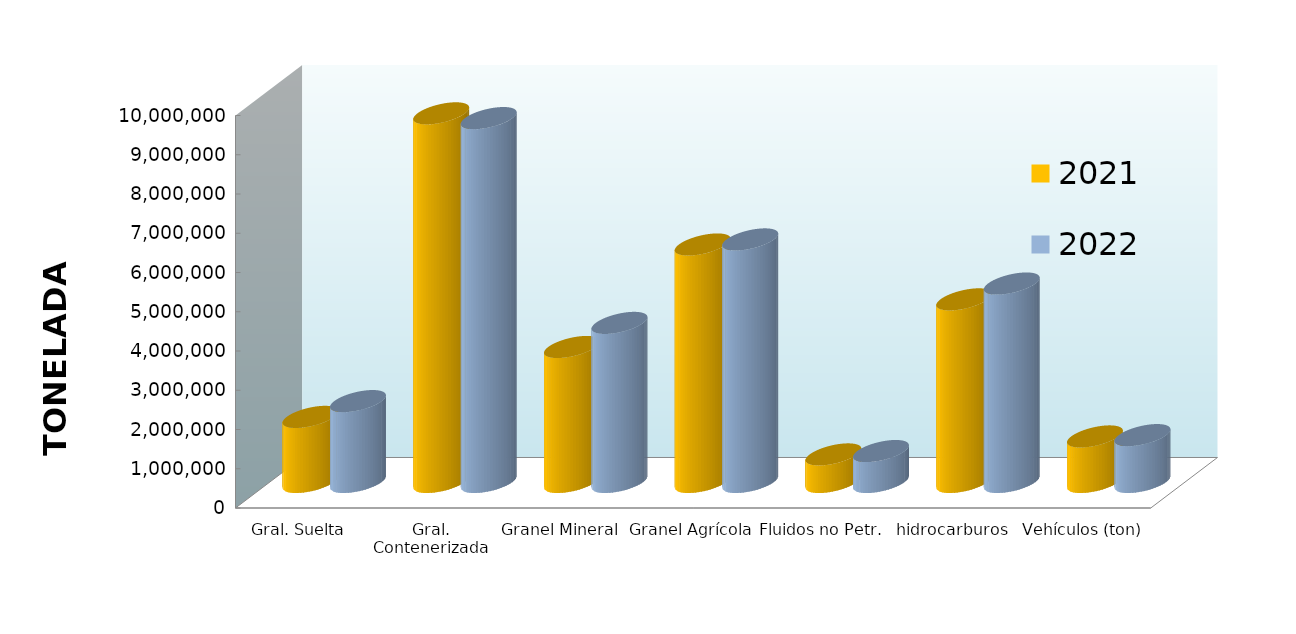
| Category | 2021 | 2022 |
|---|---|---|
| Gral. Suelta | 1658972.241 | 2061179.542 |
| Gral. Contenerizada | 9392342.895 | 9271677.081 |
| Granel Mineral | 3439833.818 | 4053284.603 |
| Granel Agrícola | 6051272.964 | 6180494.817 |
| Fluidos no Petr. | 702567.867 | 788940.466 |
| hidrocarburos | 4653247.825 | 5056818.666 |
| Vehículos (ton) | 1160857.009 | 1194632.658 |